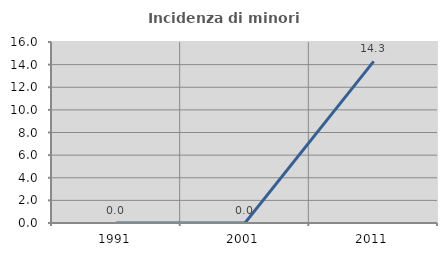
| Category | Incidenza di minori stranieri |
|---|---|
| 1991.0 | 0 |
| 2001.0 | 0 |
| 2011.0 | 14.286 |